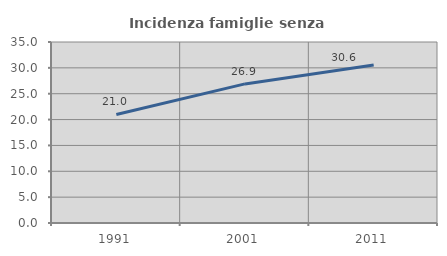
| Category | Incidenza famiglie senza nuclei |
|---|---|
| 1991.0 | 20.994 |
| 2001.0 | 26.895 |
| 2011.0 | 30.568 |